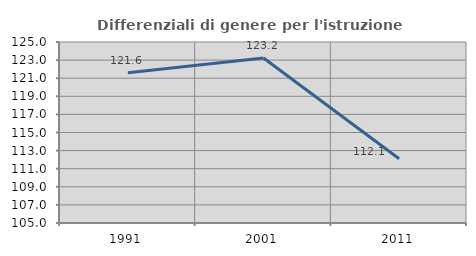
| Category | Differenziali di genere per l'istruzione superiore |
|---|---|
| 1991.0 | 121.595 |
| 2001.0 | 123.236 |
| 2011.0 | 112.094 |